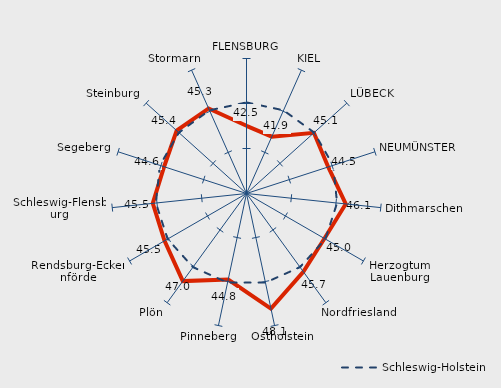
| Category | Kreise | Schleswig-Holstein |
|---|---|---|
| FLENSBURG | 42.522 | 45.12 |
| KIEL | 41.913 | 45.12 |
| LÜBECK | 45.074 | 45.12 |
| NEUMÜNSTER | 44.547 | 45.12 |
| Dithmarschen | 46.086 | 45.12 |
| Herzogtum Lauenburg | 45 | 45.12 |
| Nordfriesland | 45.742 | 45.12 |
| Ostholstein | 48.069 | 45.12 |
| Pinneberg | 44.779 | 45.12 |
| Plön | 47.034 | 45.12 |
| Rendsburg-Eckernförde | 45.515 | 45.12 |
| Schleswig-Flensburg | 45.471 | 45.12 |
| Segeberg | 44.628 | 45.12 |
| Steinburg | 45.44 | 45.12 |
| Stormarn | 45.347 | 45.12 |